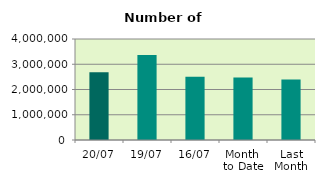
| Category | Series 0 |
|---|---|
| 20/07 | 2680890 |
| 19/07 | 3362024 |
| 16/07 | 2508900 |
| Month 
to Date | 2477839.571 |
| Last
Month | 2394428.455 |